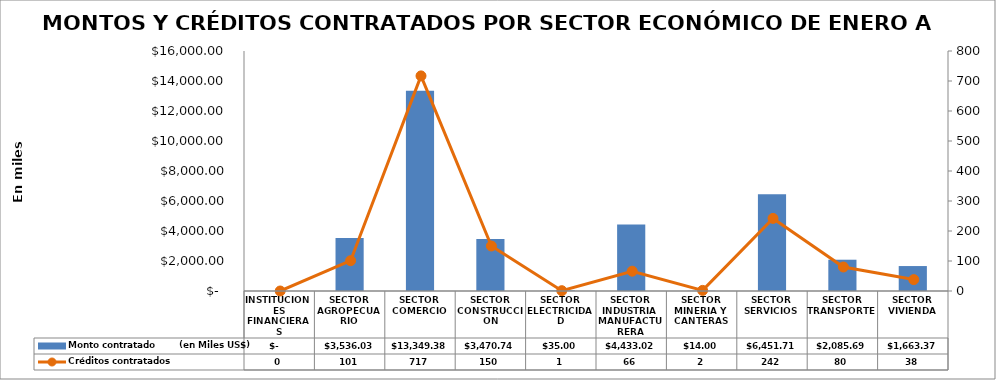
| Category | Monto contratado        (en Miles US$) |
|---|---|
| INSTITUCIONES FINANCIERAS | 0 |
| SECTOR AGROPECUARIO | 3536.027 |
| SECTOR COMERCIO | 13349.381 |
| SECTOR CONSTRUCCION | 3470.743 |
| SECTOR ELECTRICIDAD | 35 |
| SECTOR INDUSTRIA MANUFACTURERA | 4433.023 |
| SECTOR MINERIA Y CANTERAS | 14 |
| SECTOR SERVICIOS | 6451.71 |
| SECTOR TRANSPORTE | 2085.691 |
| SECTOR VIVIENDA | 1663.368 |